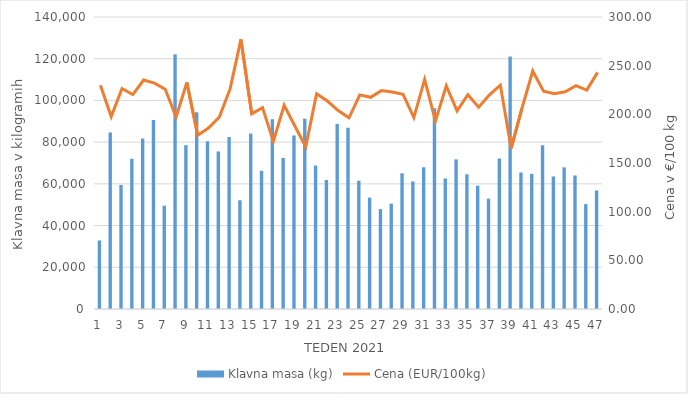
| Category | Klavna masa (kg) |
|---|---|
| 1.0 | 32871 |
| 2.0 | 84639 |
| 3.0 | 59476 |
| 4.0 | 72013 |
| 5.0 | 81759 |
| 6.0 | 90669 |
| 7.0 | 49517 |
| 8.0 | 122111 |
| 9.0 | 78545 |
| 10.0 | 94384 |
| 11.0 | 80405 |
| 12.0 | 75534 |
| 13.0 | 82440 |
| 14.0 | 52143 |
| 15.0 | 84105 |
| 16.0 | 66298 |
| 17.0 | 90925 |
| 18.0 | 72394 |
| 19.0 | 83193 |
| 20.0 | 91231 |
| 21.0 | 68763 |
| 22.0 | 61837 |
| 23.0 | 88747 |
| 24.0 | 86888 |
| 25.0 | 61507 |
| 26.0 | 53379 |
| 27.0 | 47910 |
| 28.0 | 50529 |
| 29.0 | 65062 |
| 30.0 | 61178 |
| 31.0 | 67992 |
| 32.0 | 96308 |
| 33.0 | 62558 |
| 34.0 | 71729 |
| 35.0 | 64596 |
| 36.0 | 59160 |
| 37.0 | 52905 |
| 38.0 | 72159 |
| 39.0 | 121060 |
| 40.0 | 65445 |
| 41.0 | 64780 |
| 42.0 | 78522 |
| 43.0 | 63486 |
| 44.0 | 67920 |
| 45.0 | 64023 |
| 46.0 | 50280 |
| 47.0 | 56852 |